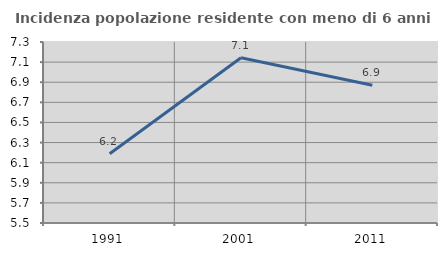
| Category | Incidenza popolazione residente con meno di 6 anni |
|---|---|
| 1991.0 | 6.188 |
| 2001.0 | 7.143 |
| 2011.0 | 6.87 |